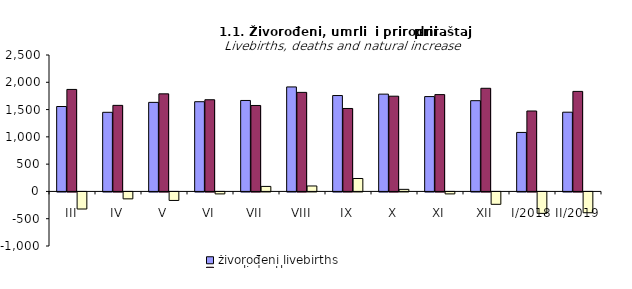
| Category | živorođeni livebirths | umrli deaths | prirodni priraštaj natural increase |
|---|---|---|---|
| III | 1556 | 1869 | -313 |
| IV | 1450 | 1577 | -127 |
| V | 1632 | 1788 | -156 |
| VI | 1644 | 1680 | -36 |
| VII | 1667 | 1575 | 92 |
| VIII | 1915 | 1815 | 100 |
| IX | 1757 | 1520 | 237 |
| X | 1783 | 1745 | 38 |
| XI | 1738 | 1774 | -36 |
| XII | 1663 | 1890 | -227 |
| I/2018 | 1081 | 1474 | -393 |
| II/2019 | 1452 | 1833 | -381 |